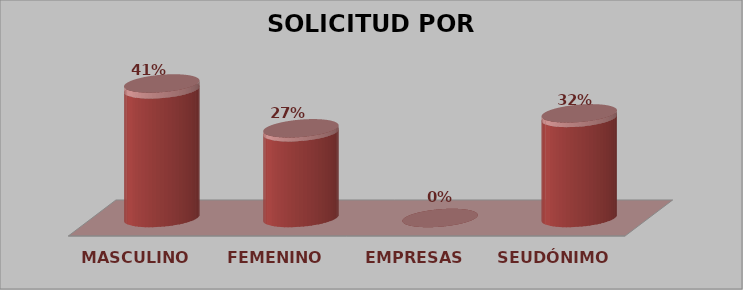
| Category | SOLICITUD POR GÉNERO | Series 1 |
|---|---|---|
| MASCULINO | 9 | 0.409 |
| FEMENINO | 6 | 0.273 |
| EMPRESAS | 0 | 0 |
| SEUDÓNIMO | 7 | 0.318 |